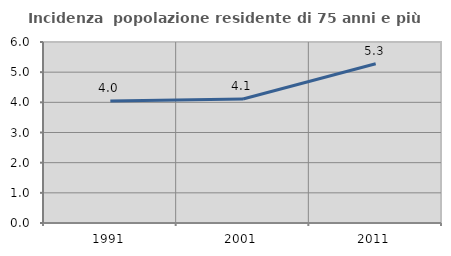
| Category | Incidenza  popolazione residente di 75 anni e più |
|---|---|
| 1991.0 | 4.041 |
| 2001.0 | 4.113 |
| 2011.0 | 5.28 |